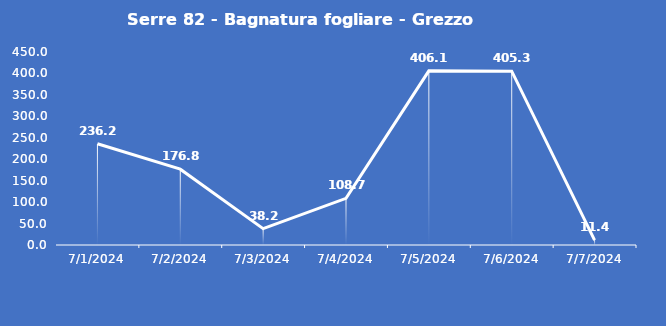
| Category | Serre 82 - Bagnatura fogliare - Grezzo (min) |
|---|---|
| 7/1/24 | 236.2 |
| 7/2/24 | 176.8 |
| 7/3/24 | 38.2 |
| 7/4/24 | 108.7 |
| 7/5/24 | 406.1 |
| 7/6/24 | 405.3 |
| 7/7/24 | 11.4 |